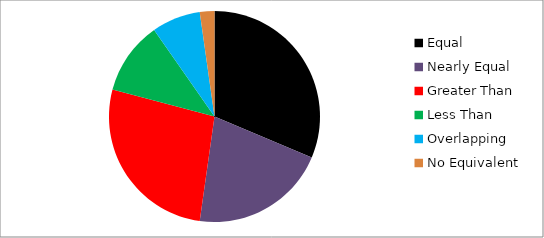
| Category | Series 0 |
|---|---|
| Equal | 42 |
| Nearly Equal | 28 |
| Greater Than | 36 |
| Less Than | 15 |
| Overlapping | 10 |
| No Equivalent | 3 |